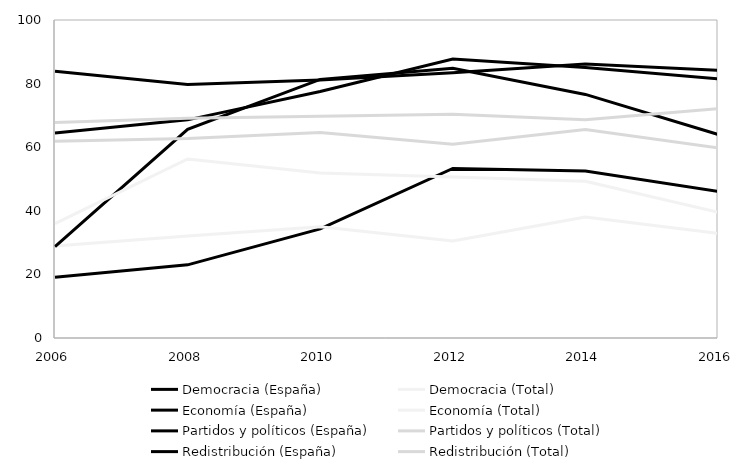
| Category | Democracia (España) | Democracia (Total) | Economía (España) | Economía (Total) | Partidos y políticos (España) | Partidos y políticos (Total) | Redistribución (España) | Redistribución (Total) |
|---|---|---|---|---|---|---|---|---|
| 2006.0 | 19.1 | 28.91 | 28.7 | 35.97 | 64.5 | 61.9 | 83.9 | 67.79 |
| 2008.0 | 23 | 32.05 | 65.6 | 56.29 | 68.6 | 62.75 | 79.7 | 69.09 |
| 2010.0 | 34.3 | 34.97 | 81.3 | 51.9 | 77.5 | 64.6 | 81.1 | 69.74 |
| 2012.0 | 53.3 | 30.53 | 84.8 | 50.59 | 87.7 | 60.96 | 83.4 | 70.37 |
| 2014.0 | 52.5 | 38.04 | 76.6 | 49.27 | 85.1 | 65.55 | 86.2 | 68.64 |
| 2016.0 | 46.1 | 32.89 | 64 | 39.57 | 81.5 | 59.81 | 84.2 | 72.11 |